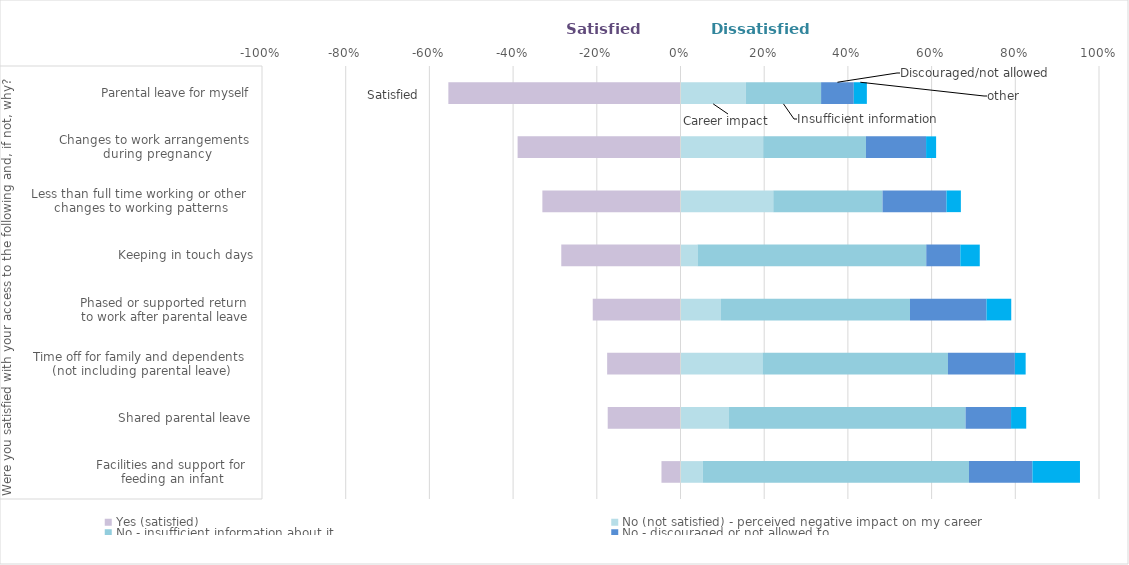
| Category | Yes (satisfied) | No (not satisfied) - perceived negative impact on my career | No - insufficient information about it | No - discouraged or not allowed to | No - other reason |
|---|---|---|---|---|---|
| 0 | -0.045 | 0.053 | 0.636 | 0.152 | 0.114 |
| 1 | -0.174 | 0.116 | 0.565 | 0.109 | 0.036 |
| 2 | -0.175 | 0.196 | 0.443 | 0.16 | 0.026 |
| 3 | -0.21 | 0.097 | 0.452 | 0.183 | 0.059 |
| 4 | -0.285 | 0.041 | 0.547 | 0.081 | 0.047 |
| 5 | -0.33 | 0.222 | 0.261 | 0.153 | 0.034 |
| 6 | -0.389 | 0.198 | 0.246 | 0.144 | 0.024 |
| 7 | -0.555 | 0.156 | 0.18 | 0.078 | 0.031 |